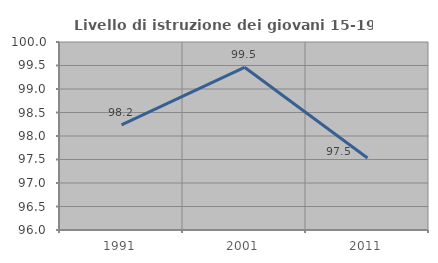
| Category | Livello di istruzione dei giovani 15-19 anni |
|---|---|
| 1991.0 | 98.238 |
| 2001.0 | 99.462 |
| 2011.0 | 97.531 |